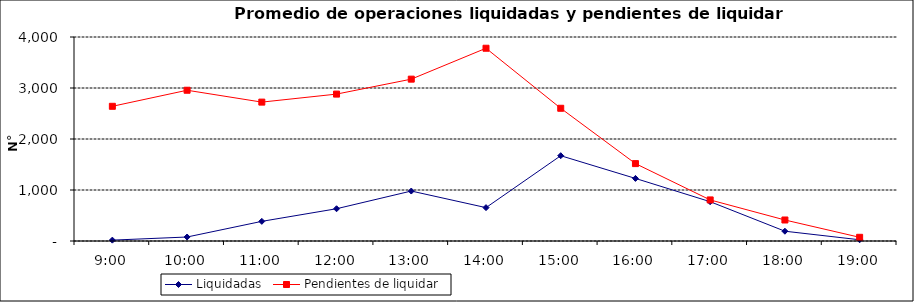
| Category | Liquidadas | Pendientes de liquidar |
|---|---|---|
| 0.375 | 17.143 | 2641.095 |
| 0.4166666666666667 | 78.143 | 2956.095 |
| 0.4583333333333333 | 385.19 | 2723.238 |
| 0.5 | 632.381 | 2880.286 |
| 0.5416666666666666 | 979.714 | 3173.429 |
| 0.5833333333333334 | 654.286 | 3779.524 |
| 0.625 | 1672.381 | 2602.476 |
| 0.6666666666666666 | 1226.762 | 1517.524 |
| 0.7083333333333334 | 770.619 | 805.429 |
| 0.75 | 192.095 | 411.905 |
| 0.7916666666666666 | 24.19 | 72.476 |